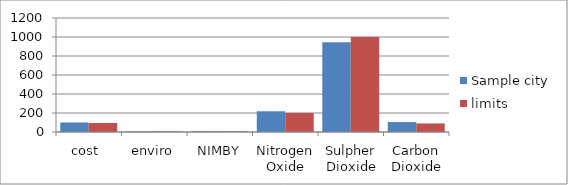
| Category | Sample city | limits |
|---|---|---|
| cost  | 100.175 | 95 |
| enviro | 6.25 | 6 |
| NIMBY | 7.3 | 7 |
| Nitrogen Oxide | 218.1 | 200 |
| Sulpher Dioxide | 945.75 | 1000 |
| Carbon Dioxide | 104.5 | 90 |